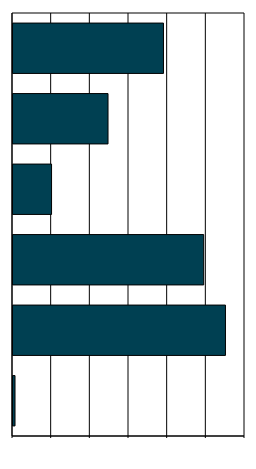
| Category | Series 0 |
|---|---|
| 0 | 1.047 |
| 1 | 109.89 |
| 2 | 98.636 |
| 3 | 19.942 |
| 4 | 49.149 |
| 5 | 77.834 |